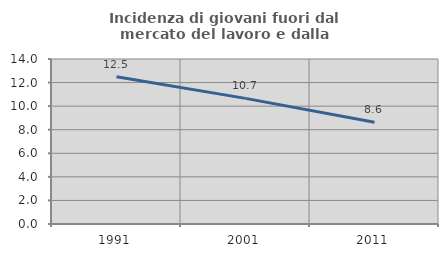
| Category | Incidenza di giovani fuori dal mercato del lavoro e dalla formazione  |
|---|---|
| 1991.0 | 12.493 |
| 2001.0 | 10.658 |
| 2011.0 | 8.627 |